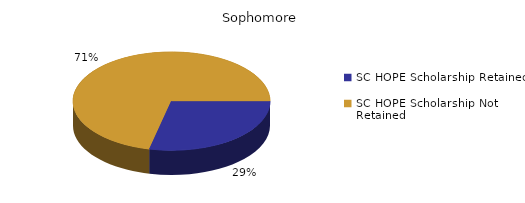
| Category | Sophomore |
|---|---|
| SC HOPE Scholarship Retained  | 2 |
| SC HOPE Scholarship Not Retained  | 5 |